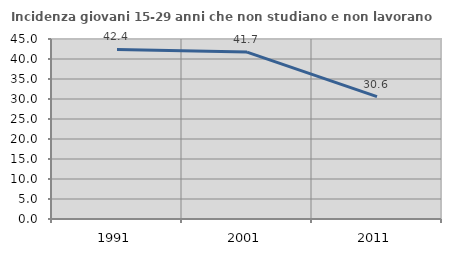
| Category | Incidenza giovani 15-29 anni che non studiano e non lavorano  |
|---|---|
| 1991.0 | 42.384 |
| 2001.0 | 41.738 |
| 2011.0 | 30.612 |